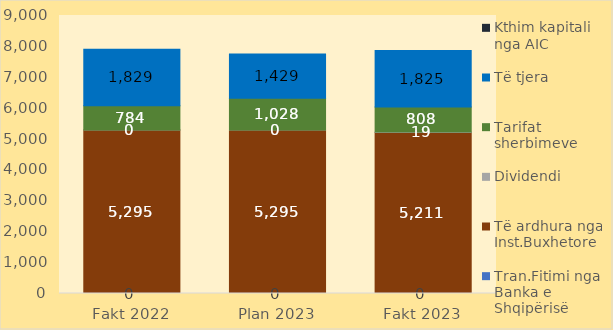
| Category | Tran.Fitimi nga Banka e Shqipërisë | Të ardhura nga Inst.Buxhetore | Dividendi | Tarifat sherbimeve | Të tjera  | Kthim kapitali nga AIC |
|---|---|---|---|---|---|---|
| Fakt 2022 | 0 | 5295.23 | 0.03 | 784.39 | 1829.02 | 0 |
| Plan 2023 | 0 | 5295.19 | 0.03 | 1028.43 | 1429 | 0 |
| Fakt 2023 | 0 | 5211.35 | 18.5 | 808.26 | 1825.37 | 0 |